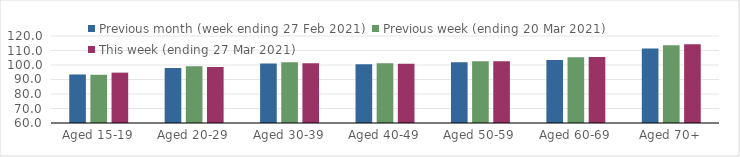
| Category | Previous month (week ending 27 Feb 2021) | Previous week (ending 20 Mar 2021) | This week (ending 27 Mar 2021) |
|---|---|---|---|
| Aged 15-19 | 93.47 | 93.25 | 94.74 |
| Aged 20-29 | 97.96 | 99.17 | 98.7 |
| Aged 30-39 | 100.96 | 101.83 | 101.2 |
| Aged 40-49 | 100.59 | 101.14 | 100.83 |
| Aged 50-59 | 101.88 | 102.64 | 102.61 |
| Aged 60-69 | 103.39 | 105.36 | 105.51 |
| Aged 70+ | 111.3 | 113.54 | 114.26 |